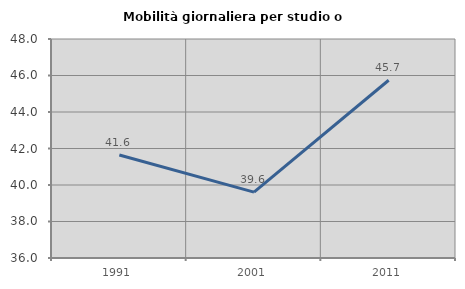
| Category | Mobilità giornaliera per studio o lavoro |
|---|---|
| 1991.0 | 41.644 |
| 2001.0 | 39.608 |
| 2011.0 | 45.739 |